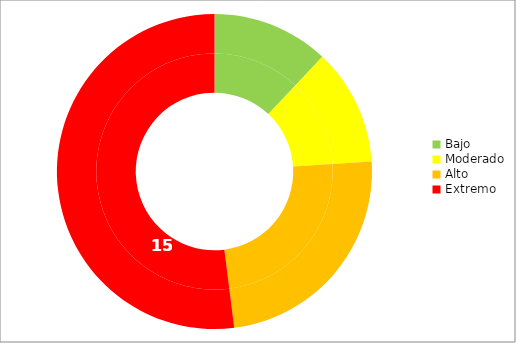
| Category | Series 1 | Series 0 |
|---|---|---|
| Bajo | 12 | 12 |
| Moderado | 12 | 12 |
| Alto | 24 | 24 |
| Extremo | 52 | 52 |